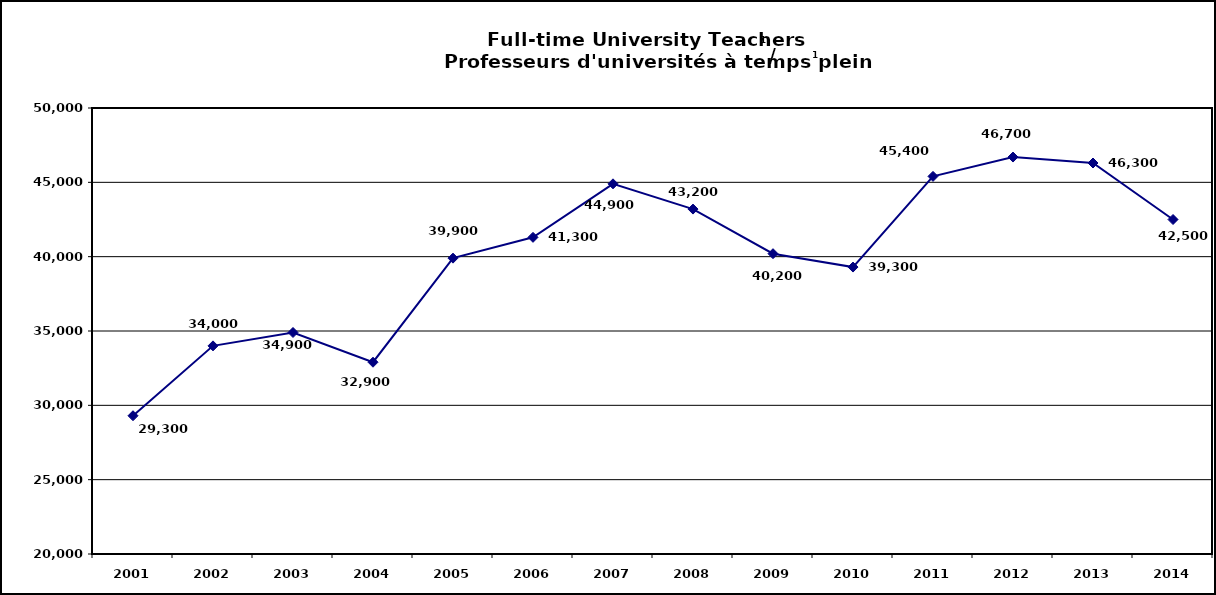
| Category | Full-time University Teachers / Professeurs d'universités à temps plein |
|---|---|
| 2001.0 | 29300 |
| 2002.0 | 34000 |
| 2003.0 | 34900 |
| 2004.0 | 32900 |
| 2005.0 | 39900 |
| 2006.0 | 41300 |
| 2007.0 | 44900 |
| 2008.0 | 43200 |
| 2009.0 | 40200 |
| 2010.0 | 39300 |
| 2011.0 | 45400 |
| 2012.0 | 46700 |
| 2013.0 | 46300 |
| 2014.0 | 42500 |